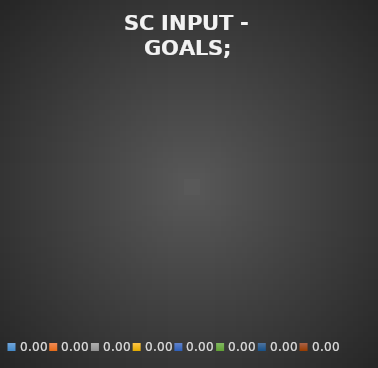
| Category | Goals |
|---|---|
| 0.0 | 0 |
| 0.0 | 0 |
| 0.0 | 0 |
| 0.0 | 0 |
| 0.0 | 0 |
| 0.0 | 0 |
| 0.0 | 0 |
| 0.0 | 0 |